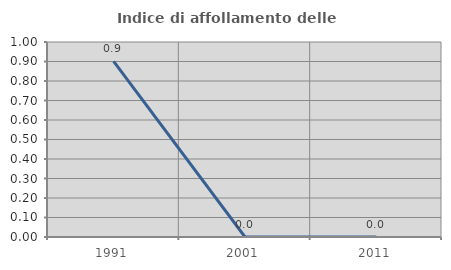
| Category | Indice di affollamento delle abitazioni  |
|---|---|
| 1991.0 | 0.901 |
| 2001.0 | 0 |
| 2011.0 | 0 |